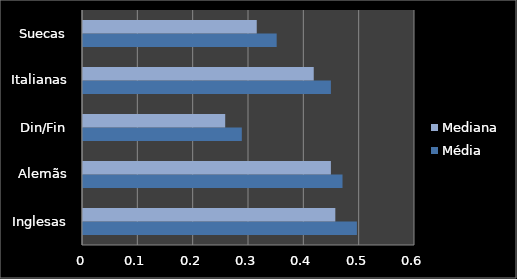
| Category | Média | Mediana |
|---|---|---|
| Inglesas | 0.495 | 0.456 |
| Alemãs | 0.469 | 0.448 |
| Din/Fin | 0.287 | 0.257 |
| Italianas | 0.448 | 0.417 |
| Suecas | 0.35 | 0.314 |